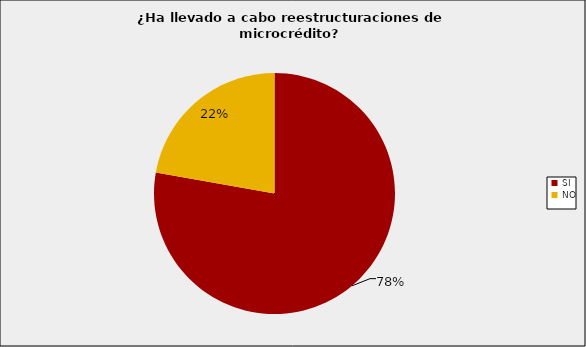
| Category | Entidades Supervisadas SFC |
|---|---|
| SI | 0.778 |
| NO | 0.222 |